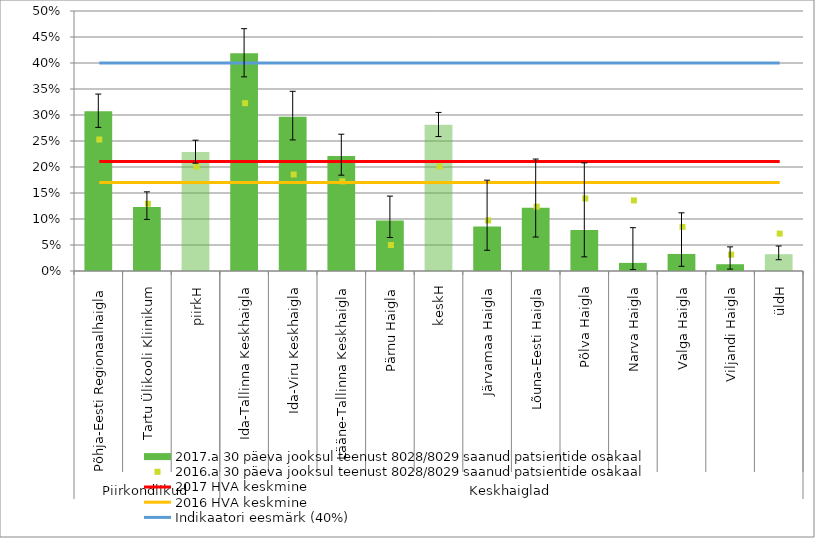
| Category | 2017.a 30 päeva jooksul teenust 8028/8029 saanud patsientide osakaal |
|---|---|
| 0 | 0.307 |
| 1 | 0.123 |
| 2 | 0.229 |
| 3 | 0.419 |
| 4 | 0.297 |
| 5 | 0.221 |
| 6 | 0.097 |
| 7 | 0.281 |
| 8 | 0.086 |
| 9 | 0.122 |
| 10 | 0.079 |
| 11 | 0.016 |
| 12 | 0.033 |
| 13 | 0.013 |
| 14 | 0.032 |